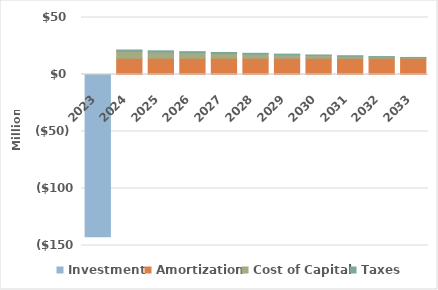
| Category | Investment | Amortization | Cost of Capital | Taxes |
|---|---|---|---|---|
| 2023.0 | -142.26 | 0 | 0 | 0 |
| 2024.0 | 0 | 14.226 | 6.065 | 1.221 |
| 2025.0 | 0 | 14.226 | 5.458 | 1.099 |
| 2026.0 | 0 | 14.226 | 4.852 | 0.977 |
| 2027.0 | 0 | 14.226 | 4.245 | 0.855 |
| 2028.0 | 0 | 14.226 | 3.639 | 0.733 |
| 2029.0 | 0 | 14.226 | 3.032 | 0.611 |
| 2030.0 | 0 | 14.226 | 2.426 | 0.489 |
| 2031.0 | 0 | 14.226 | 1.819 | 0.366 |
| 2032.0 | 0 | 14.226 | 1.213 | 0.244 |
| 2033.0 | 0 | 14.226 | 0.606 | 0.122 |